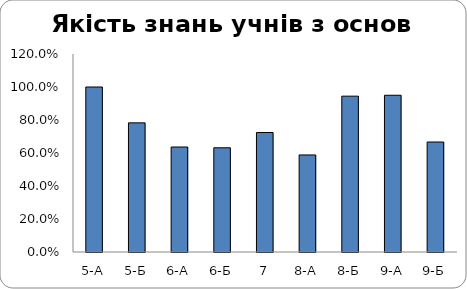
| Category | Series 0 |
|---|---|
| 5-А | 1 |
| 5-Б | 0.783 |
| 6-А | 0.636 |
| 6-Б | 0.632 |
| 7 | 0.724 |
| 8-А | 0.588 |
| 8-Б | 0.944 |
| 9-А | 0.95 |
| 9-Б | 0.667 |